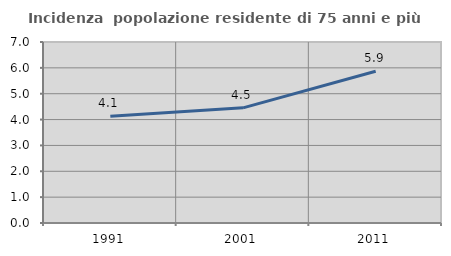
| Category | Incidenza  popolazione residente di 75 anni e più |
|---|---|
| 1991.0 | 4.127 |
| 2001.0 | 4.453 |
| 2011.0 | 5.871 |